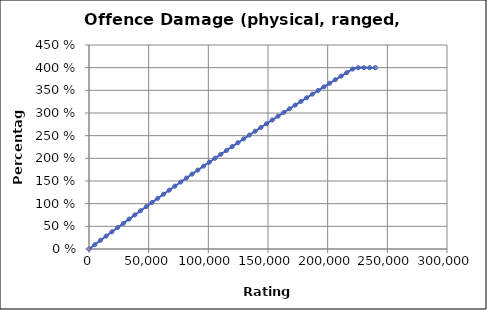
| Category | Offence Damage (physical, ranged, tactical) |
|---|---|
| 0.0 | 0 |
| 4800.0 | 0.096 |
| 9600.0 | 0.191 |
| 14400.0 | 0.285 |
| 19200.0 | 0.379 |
| 24000.0 | 0.473 |
| 28800.0 | 0.566 |
| 33600.0 | 0.659 |
| 38400.0 | 0.752 |
| 43200.0 | 0.844 |
| 48000.0 | 0.935 |
| 52800.0 | 1.026 |
| 57600.0 | 1.117 |
| 62400.0 | 1.207 |
| 67200.0 | 1.297 |
| 72000.0 | 1.387 |
| 76800.0 | 1.476 |
| 81600.0 | 1.564 |
| 86400.0 | 1.653 |
| 91200.0 | 1.74 |
| 96000.0 | 1.828 |
| 100800.0 | 1.915 |
| 105600.0 | 2.002 |
| 110400.0 | 2.088 |
| 115200.0 | 2.174 |
| 120000.0 | 2.259 |
| 124800.0 | 2.344 |
| 129600.0 | 2.429 |
| 134400.0 | 2.513 |
| 139200.0 | 2.597 |
| 144000.0 | 2.681 |
| 148800.0 | 2.764 |
| 153600.0 | 2.847 |
| 158400.0 | 2.929 |
| 163200.0 | 3.011 |
| 168000.0 | 3.093 |
| 172800.0 | 3.174 |
| 177600.0 | 3.255 |
| 182400.0 | 3.336 |
| 187200.0 | 3.416 |
| 192000.0 | 3.496 |
| 196800.0 | 3.576 |
| 201600.0 | 3.655 |
| 206400.0 | 3.734 |
| 211200.0 | 3.812 |
| 216000.0 | 3.891 |
| 220800.0 | 3.968 |
| 225600.0 | 4 |
| 230400.0 | 4 |
| 235200.0 | 4 |
| 240000.0 | 4 |